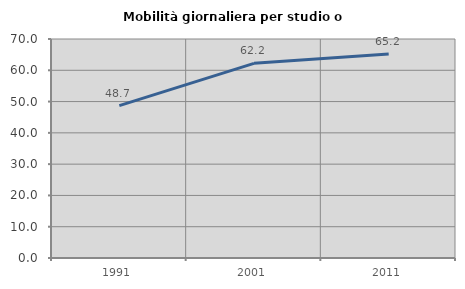
| Category | Mobilità giornaliera per studio o lavoro |
|---|---|
| 1991.0 | 48.725 |
| 2001.0 | 62.224 |
| 2011.0 | 65.187 |